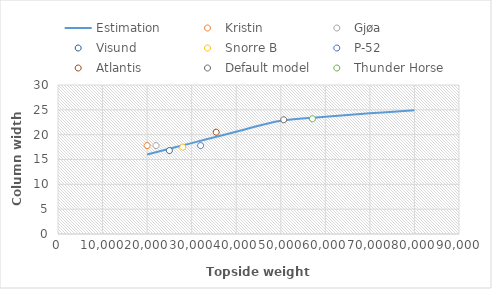
| Category | Estimation |
|---|---|
| 20000.0 | 16 |
| 30000.0 | 18.3 |
| 40000.0 | 20.6 |
| 50000.0 | 22.8 |
| 60000.0 | 23.6 |
| 70000.0 | 24.3 |
| 80000.0 | 24.9 |